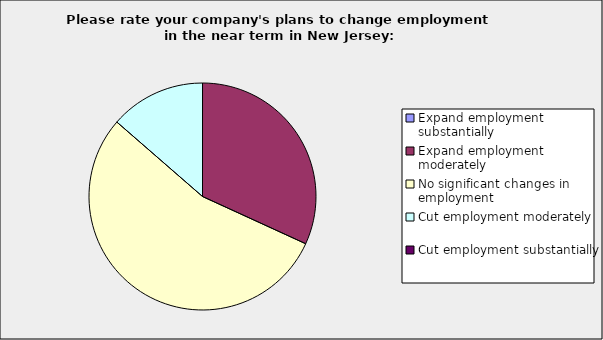
| Category | Series 0 |
|---|---|
| Expand employment substantially | 0 |
| Expand employment moderately | 0.318 |
| No significant changes in employment | 0.545 |
| Cut employment moderately | 0.136 |
| Cut employment substantially | 0 |